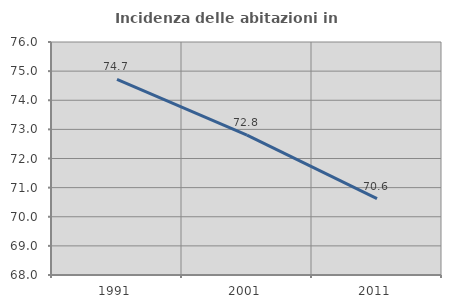
| Category | Incidenza delle abitazioni in proprietà  |
|---|---|
| 1991.0 | 74.717 |
| 2001.0 | 72.802 |
| 2011.0 | 70.619 |